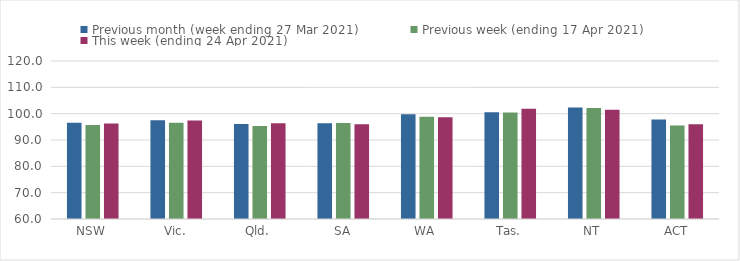
| Category | Previous month (week ending 27 Mar 2021) | Previous week (ending 17 Apr 2021) | This week (ending 24 Apr 2021) |
|---|---|---|---|
| NSW | 96.54 | 95.68 | 96.23 |
| Vic. | 97.51 | 96.52 | 97.37 |
| Qld. | 96.09 | 95.34 | 96.33 |
| SA | 96.34 | 96.41 | 95.94 |
| WA | 99.74 | 98.79 | 98.64 |
| Tas. | 100.56 | 100.49 | 101.9 |
| NT | 102.38 | 102.15 | 101.49 |
| ACT | 97.81 | 95.53 | 96.02 |